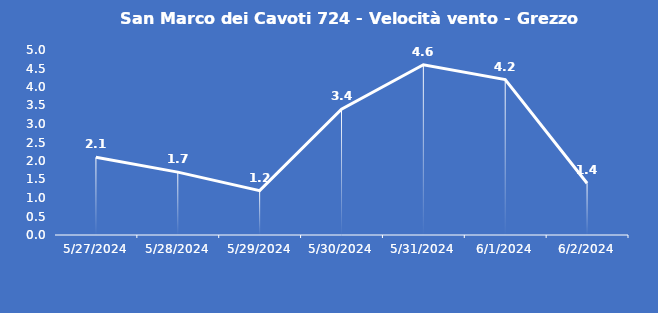
| Category | San Marco dei Cavoti 724 - Velocità vento - Grezzo (m/s) |
|---|---|
| 5/27/24 | 2.1 |
| 5/28/24 | 1.7 |
| 5/29/24 | 1.2 |
| 5/30/24 | 3.4 |
| 5/31/24 | 4.6 |
| 6/1/24 | 4.2 |
| 6/2/24 | 1.4 |